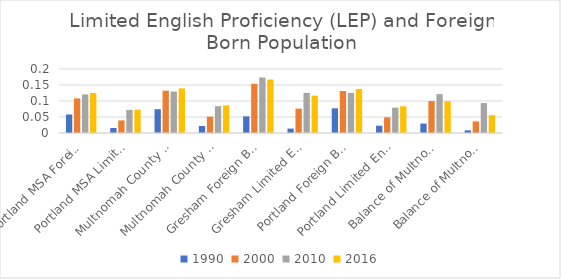
| Category | 1990 | 2000 | 2010 | 2016 |
|---|---|---|---|---|
| 0 |  |  |  | 0.125 |
| 1 |  |  |  | 0.073 |
| 2 |  |  |  | 0.139 |
| 3 |  |  |  | 0.086 |
| 4 |  |  |  | 0.167 |
| 5 |  |  |  | 0.117 |
| 6 |  |  |  | 0.137 |
| 7 |  |  |  | 0.084 |
| 8 |  |  |  | 0.099 |
| 9 |  |  |  | 0.055 |